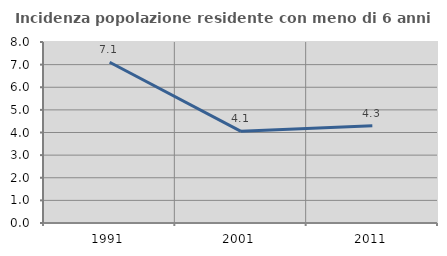
| Category | Incidenza popolazione residente con meno di 6 anni |
|---|---|
| 1991.0 | 7.107 |
| 2001.0 | 4.052 |
| 2011.0 | 4.303 |